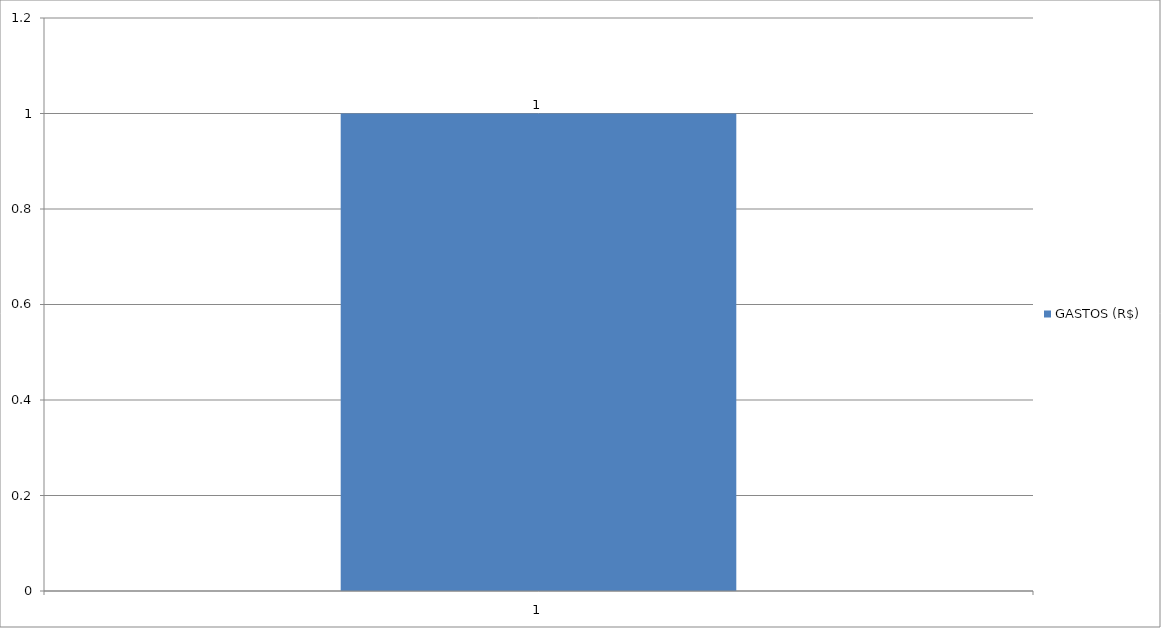
| Category | GASTOS (R$) |
|---|---|
| 0 | 1 |